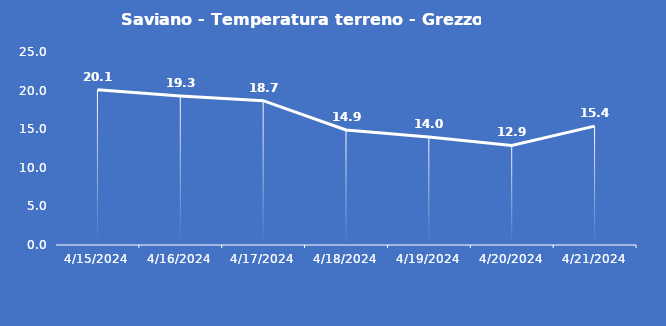
| Category | Saviano - Temperatura terreno - Grezzo (°C) |
|---|---|
| 4/15/24 | 20.1 |
| 4/16/24 | 19.3 |
| 4/17/24 | 18.7 |
| 4/18/24 | 14.9 |
| 4/19/24 | 14 |
| 4/20/24 | 12.9 |
| 4/21/24 | 15.4 |